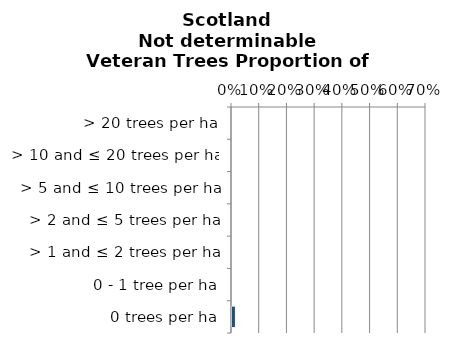
| Category | Not determinable |
|---|---|
| 0 trees per ha | 0.012 |
| 0 - 1 tree per ha | 0 |
| > 1 and ≤ 2 trees per ha | 0 |
| > 2 and ≤ 5 trees per ha | 0 |
| > 5 and ≤ 10 trees per ha | 0 |
| > 10 and ≤ 20 trees per ha | 0 |
| > 20 trees per ha | 0 |